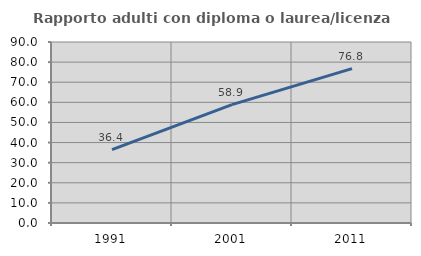
| Category | Rapporto adulti con diploma o laurea/licenza media  |
|---|---|
| 1991.0 | 36.441 |
| 2001.0 | 58.859 |
| 2011.0 | 76.762 |